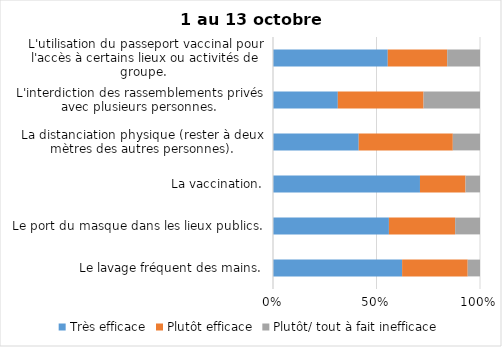
| Category | Très efficace | Plutôt efficace | Plutôt/ tout à fait inefficace |
|---|---|---|---|
| Le lavage fréquent des mains. | 63 | 32 | 6 |
| Le port du masque dans les lieux publics. | 56 | 32 | 12 |
| La vaccination. | 71 | 22 | 7 |
| La distanciation physique (rester à deux mètres des autres personnes). | 41 | 45 | 13 |
| L'interdiction des rassemblements privés avec plusieurs personnes. | 31 | 41 | 27 |
| L'utilisation du passeport vaccinal pour l'accès à certains lieux ou activités de groupe.  | 56 | 29 | 16 |